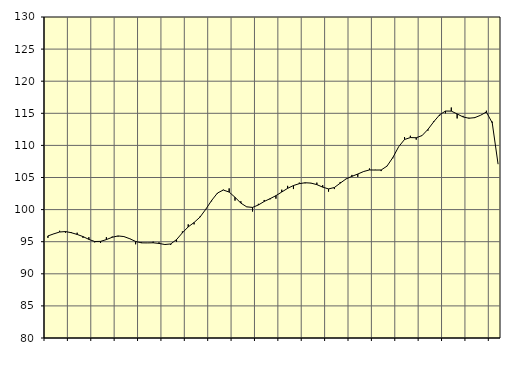
| Category | Piggar | Samtliga fast anställda (inkl. fast anställda utomlands) |
|---|---|---|
| nan | 95.6 | 95.9 |
| 1.0 | 96.2 | 96.22 |
| 1.0 | 96.7 | 96.51 |
| 1.0 | 96.4 | 96.58 |
| nan | 96.5 | 96.4 |
| 2.0 | 96.4 | 96.13 |
| 2.0 | 95.6 | 95.8 |
| 2.0 | 95.7 | 95.36 |
| nan | 94.9 | 95.03 |
| 3.0 | 94.8 | 95.05 |
| 3.0 | 95.7 | 95.33 |
| 3.0 | 95.8 | 95.69 |
| nan | 95.8 | 95.9 |
| 4.0 | 95.8 | 95.8 |
| 4.0 | 95.5 | 95.46 |
| 4.0 | 94.6 | 95.04 |
| nan | 94.9 | 94.82 |
| 5.0 | 94.8 | 94.81 |
| 5.0 | 95 | 94.83 |
| 5.0 | 94.9 | 94.73 |
| nan | 94.6 | 94.56 |
| 6.0 | 94.5 | 94.65 |
| 6.0 | 95 | 95.33 |
| 6.0 | 96.6 | 96.38 |
| nan | 97.7 | 97.31 |
| 7.0 | 97.7 | 97.99 |
| 7.0 | 98.9 | 98.82 |
| 7.0 | 100.1 | 100.05 |
| nan | 101.3 | 101.42 |
| 8.0 | 102.5 | 102.58 |
| 8.0 | 103.1 | 103.05 |
| 8.0 | 103.3 | 102.73 |
| nan | 101.4 | 101.92 |
| 9.0 | 101.3 | 101.01 |
| 9.0 | 100.4 | 100.43 |
| 9.0 | 99.7 | 100.34 |
| nan | 100.9 | 100.72 |
| 10.0 | 101.5 | 101.27 |
| 10.0 | 101.6 | 101.7 |
| 10.0 | 101.7 | 102.17 |
| nan | 103.1 | 102.74 |
| 11.0 | 103.7 | 103.31 |
| 11.0 | 103.2 | 103.75 |
| 11.0 | 104.2 | 104.04 |
| nan | 104.1 | 104.18 |
| 12.0 | 104.1 | 104.13 |
| 12.0 | 104.2 | 103.89 |
| 12.0 | 103.8 | 103.5 |
| nan | 102.8 | 103.22 |
| 13.0 | 103.2 | 103.44 |
| 13.0 | 104.3 | 104.12 |
| 13.0 | 104.8 | 104.78 |
| nan | 105.4 | 105.18 |
| 14.0 | 105.1 | 105.54 |
| 14.0 | 105.9 | 105.93 |
| 14.0 | 106.4 | 106.18 |
| nan | 106.2 | 106.16 |
| 15.0 | 106 | 106.17 |
| 15.0 | 106.8 | 106.77 |
| 15.0 | 108 | 108.11 |
| nan | 109.8 | 109.8 |
| 16.0 | 111.3 | 110.92 |
| 16.0 | 111.5 | 111.22 |
| 16.0 | 110.9 | 111.19 |
| nan | 111.5 | 111.53 |
| 17.0 | 112.3 | 112.49 |
| 17.0 | 113.8 | 113.69 |
| 17.0 | 114.6 | 114.76 |
| nan | 115 | 115.35 |
| 18.0 | 115.9 | 115.34 |
| 18.0 | 114.2 | 114.9 |
| 18.0 | 114.6 | 114.44 |
| nan | 114.3 | 114.23 |
| 19.0 | 114.4 | 114.32 |
| 19.0 | 114.7 | 114.69 |
| 19.0 | 115.4 | 115.2 |
| nan | 113.7 | 113.52 |
| 20.0 | 107.1 | 107.09 |